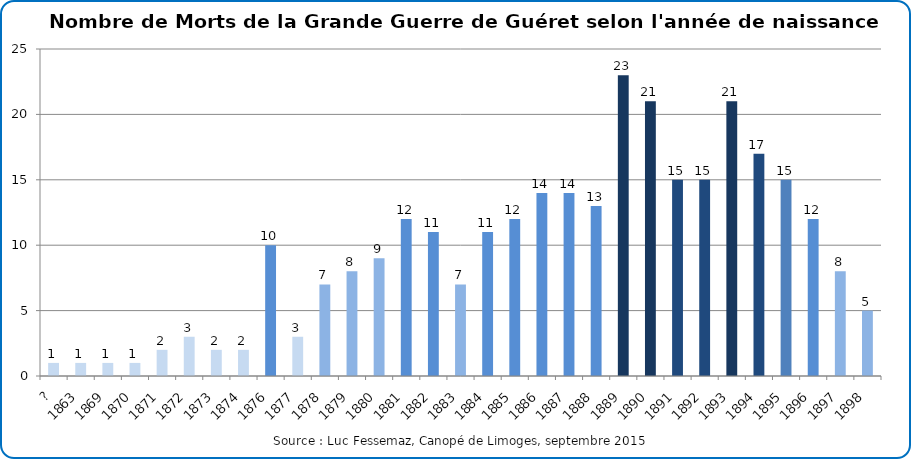
| Category | Nombre de Morts de Guéret de la Grande Guerre selon l'année de naissance |
|---|---|
| ? | 1 |
| 1863 | 1 |
| 1869 | 1 |
| 1870 | 1 |
| 1871 | 2 |
| 1872 | 3 |
| 1873 | 2 |
| 1874 | 2 |
| 1876 | 10 |
| 1877 | 3 |
| 1878 | 7 |
| 1879 | 8 |
| 1880 | 9 |
| 1881 | 12 |
| 1882 | 11 |
| 1883 | 7 |
| 1884 | 11 |
| 1885 | 12 |
| 1886 | 14 |
| 1887 | 14 |
| 1888 | 13 |
| 1889 | 23 |
| 1890 | 21 |
| 1891 | 15 |
| 1892 | 15 |
| 1893 | 21 |
| 1894 | 17 |
| 1895 | 15 |
| 1896 | 12 |
| 1897 | 8 |
| 1898 | 5 |